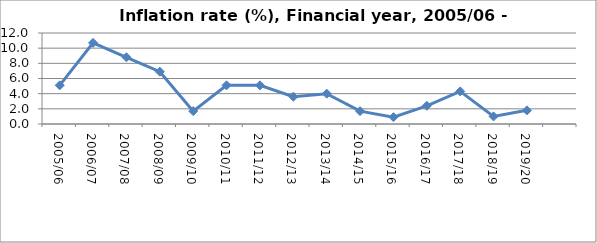
| Category | Inflation rate |
|---|---|
| 2005/06  | 5.1 |
| 2006/07  | 10.7 |
| 2007/08  | 8.8 |
| 2008/09  | 6.9 |
| 2009/10 | 1.7 |
| 2010/11 | 5.1 |
| 2011/12 | 5.1 |
| 2012/13 | 3.6 |
| 2013/14 | 4 |
| 2014/15 | 1.7 |
| 2015/16 | 0.9 |
| 2016/17 | 2.4 |
| 2017/18 | 4.3 |
| 2018/19 | 1 |
| 2019/20 | 1.8 |